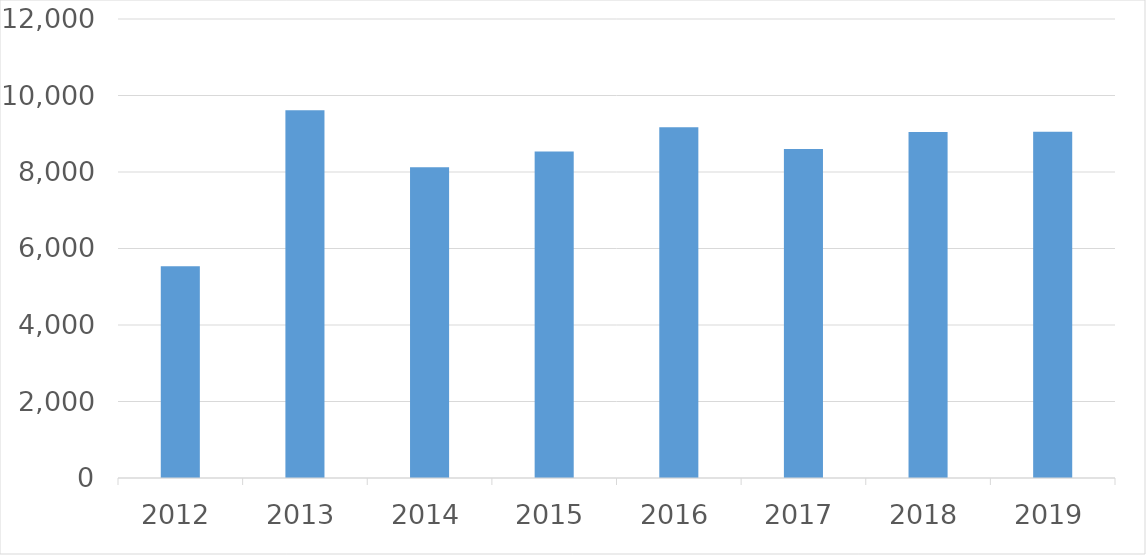
| Category | Series 0 |
|---|---|
| 2012 | 5536 |
| 2013 | 9615 |
| 2014 | 8126 |
| 2015 | 8535 |
| 2016 | 9171 |
| 2017 | 8603 |
| 2018 | 9048 |
| 2019 | 9054 |